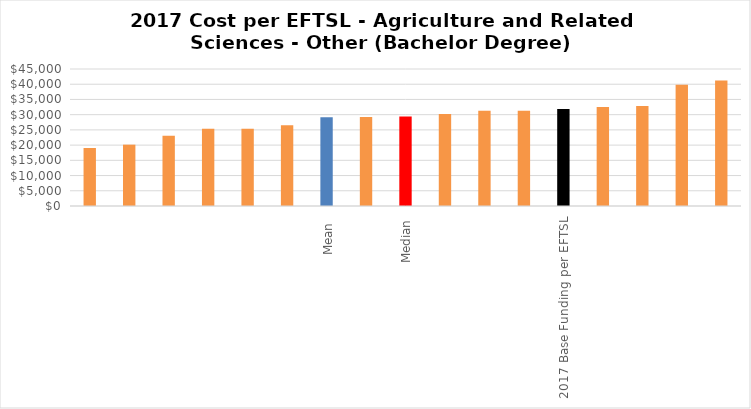
| Category | Series 0 |
|---|---|
|  | 19048.245 |
|  | 20150.099 |
|  | 23069.604 |
|  | 25354.685 |
|  | 25375.086 |
|  | 26541.713 |
| Mean  | 29158 |
|  | 29271.458 |
| Median | 29368.706 |
|  | 30228.072 |
|  | 31267.015 |
|  | 31296.561 |
| 2017 Base Funding per EFTSL | 31859 |